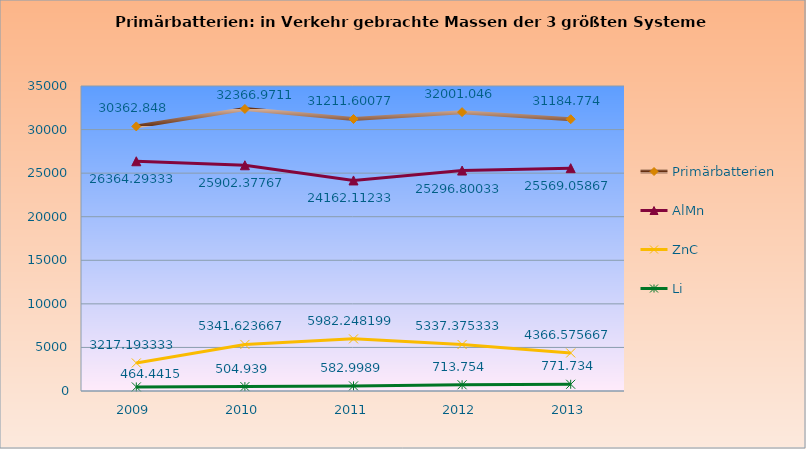
| Category | Primärbatterien | AlMn | ZnC | Li |
|---|---|---|---|---|
| 2009.0 | 30362.848 | 26364.293 | 3217.193 | 464.441 |
| 2010.0 | 32366.971 | 25902.378 | 5341.624 | 504.939 |
| 2011.0 | 31211.601 | 24162.112 | 5982.248 | 582.999 |
| 2012.0 | 32001.046 | 25296.8 | 5337.375 | 713.754 |
| 2013.0 | 31184.774 | 25569.059 | 4366.576 | 771.734 |